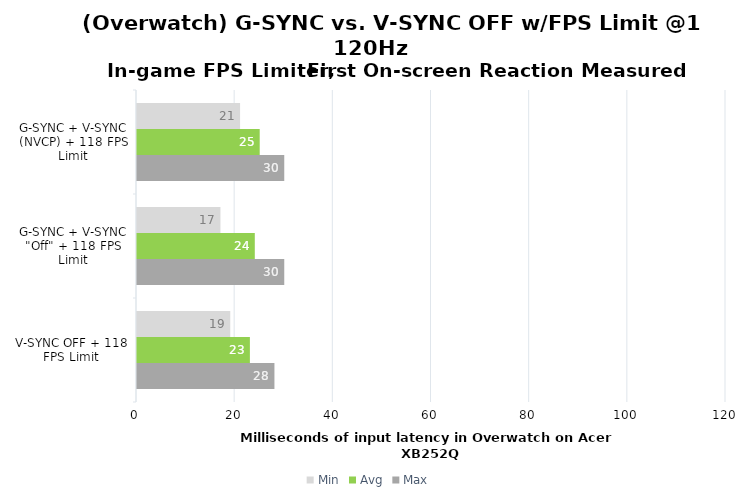
| Category | Min | Avg | Max |
|---|---|---|---|
| G-SYNC + V-SYNC (NVCP) + 118 FPS Limit | 21 | 25 | 30 |
| G-SYNC + V-SYNC "Off" + 118 FPS Limit | 17 | 24 | 30 |
| V-SYNC OFF + 118 FPS Limit | 19 | 23 | 28 |